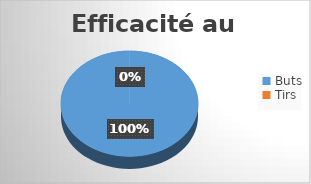
| Category | Series 0 |
|---|---|
| Buts | 100 |
| Tirs | 0 |